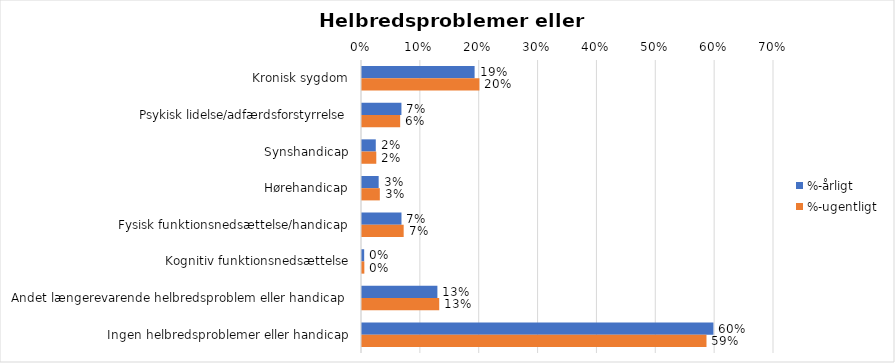
| Category | %-årligt | %-ugentligt |
|---|---|---|
| Kronisk sygdom | 0.191 | 0.2 |
| Psykisk lidelse/adfærdsforstyrrelse | 0.067 | 0.065 |
| Synshandicap | 0.023 | 0.024 |
| Hørehandicap | 0.028 | 0.03 |
| Fysisk funktionsnedsættelse/handicap | 0.067 | 0.071 |
| Kognitiv funktionsnedsættelse | 0.004 | 0.004 |
| Andet længerevarende helbredsproblem eller handicap  | 0.128 | 0.131 |
| Ingen helbredsproblemer eller handicap | 0.597 | 0.585 |